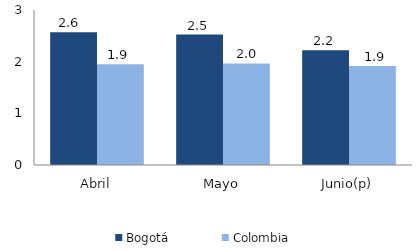
| Category | Bogotá | Colombia |
|---|---|---|
| Abril | 2.571 | 1.949 |
| Mayo | 2.526 | 1.965 |
| Junio(p) | 2.221 | 1.918 |